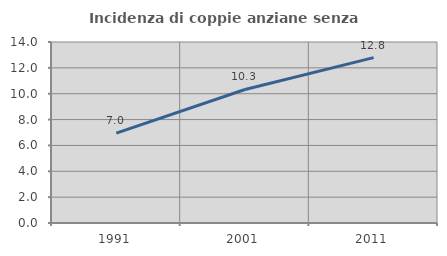
| Category | Incidenza di coppie anziane senza figli  |
|---|---|
| 1991.0 | 6.952 |
| 2001.0 | 10.329 |
| 2011.0 | 12.791 |